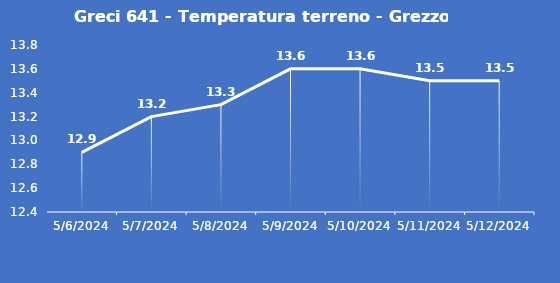
| Category | Greci 641 - Temperatura terreno - Grezzo (°C) |
|---|---|
| 5/6/24 | 12.9 |
| 5/7/24 | 13.2 |
| 5/8/24 | 13.3 |
| 5/9/24 | 13.6 |
| 5/10/24 | 13.6 |
| 5/11/24 | 13.5 |
| 5/12/24 | 13.5 |